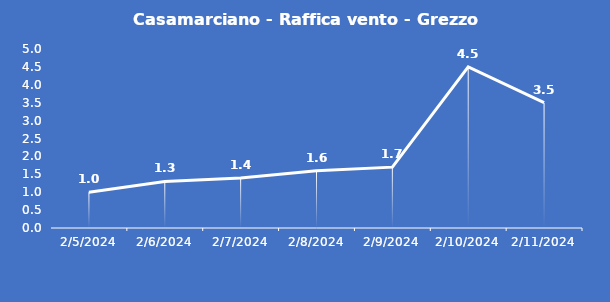
| Category | Casamarciano - Raffica vento - Grezzo (m/s) |
|---|---|
| 2/5/24 | 1 |
| 2/6/24 | 1.3 |
| 2/7/24 | 1.4 |
| 2/8/24 | 1.6 |
| 2/9/24 | 1.7 |
| 2/10/24 | 4.5 |
| 2/11/24 | 3.5 |